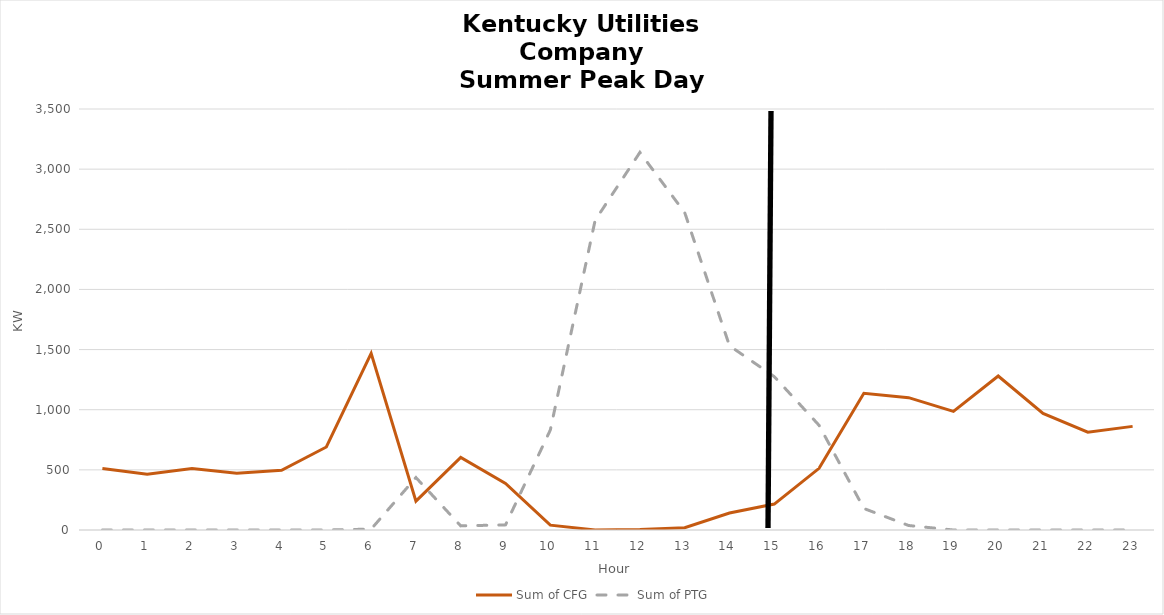
| Category | Sum of CFG | Sum of PTG |
|---|---|---|
| 0.0 | 511.463 | 0 |
| 1.0 | 463.595 | 0 |
| 2.0 | 510.196 | 0 |
| 3.0 | 471.293 | 0 |
| 4.0 | 496.92 | 0 |
| 5.0 | 690.009 | 0 |
| 6.0 | 1468.47 | 7.381 |
| 7.0 | 239.483 | 435.971 |
| 8.0 | 603.641 | 34.275 |
| 9.0 | 387.361 | 42.606 |
| 10.0 | 40.413 | 831.029 |
| 11.0 | 0.658 | 2573.878 |
| 12.0 | 4.019 | 3139.237 |
| 13.0 | 19.561 | 2638.931 |
| 14.0 | 140.703 | 1531.842 |
| 15.0 | 215.744 | 1274.917 |
| 16.0 | 512.802 | 870.468 |
| 17.0 | 1137.076 | 179.009 |
| 18.0 | 1100.098 | 37.32 |
| 19.0 | 986.312 | 0 |
| 20.0 | 1280.459 | 0 |
| 21.0 | 968.602 | 0 |
| 22.0 | 813.259 | 0 |
| 23.0 | 861.577 | 0 |